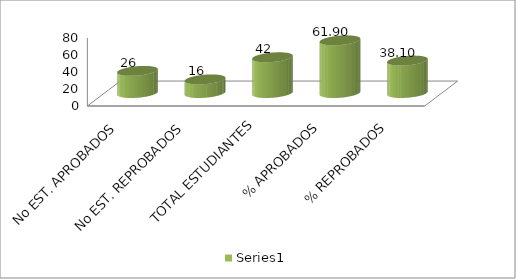
| Category | Series 0 |
|---|---|
| No EST. APROBADOS | 26 |
| No EST. REPROBADOS | 16 |
| TOTAL ESTUDIANTES | 42 |
| % APROBADOS | 61.905 |
| % REPROBADOS | 38.095 |